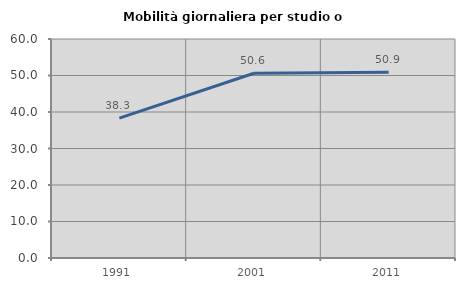
| Category | Mobilità giornaliera per studio o lavoro |
|---|---|
| 1991.0 | 38.316 |
| 2001.0 | 50.613 |
| 2011.0 | 50.858 |